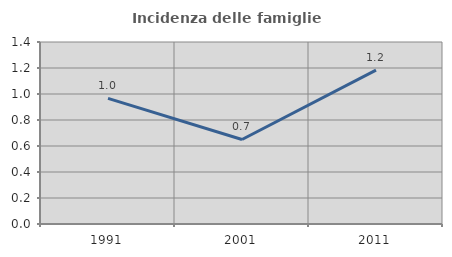
| Category | Incidenza delle famiglie numerose |
|---|---|
| 1991.0 | 0.966 |
| 2001.0 | 0.65 |
| 2011.0 | 1.184 |